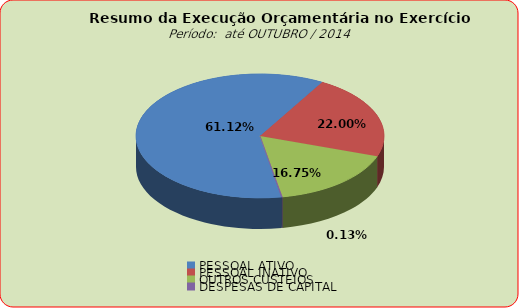
| Category | Series 0 |
|---|---|
| PESSOAL ATIVO | 98826938.6 |
| PESSOAL INATIVO | 35577971.59 |
| OUTROS CUSTEIOS | 27076553.9 |
| DESPESAS DE CAPITAL | 207037.95 |